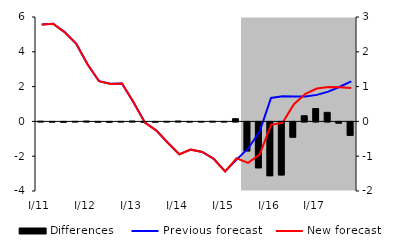
| Category | Differences |
|---|---|
| 0 | 0.006 |
| 1 | -0.003 |
| 2 | -0.007 |
| 3 | 0.002 |
| 4 | 0.01 |
| 5 | -0.005 |
| 6 | -0.007 |
| 7 | 0.001 |
| 8 | 0.011 |
| 9 | -0.006 |
| 10 | -0.005 |
| 11 | 0.001 |
| 12 | 0.011 |
| 13 | -0.001 |
| 14 | 0 |
| 15 | 0.004 |
| 16 | -0.001 |
| 17 | 0.078 |
| 18 | -0.832 |
| 19 | -1.318 |
| 20 | -1.546 |
| 21 | -1.523 |
| 22 | -0.439 |
| 23 | 0.163 |
| 24 | 0.368 |
| 25 | 0.26 |
| 26 | -0.033 |
| 27 | -0.386 |